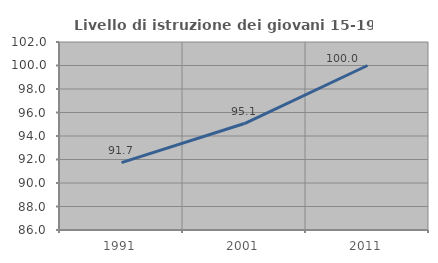
| Category | Livello di istruzione dei giovani 15-19 anni |
|---|---|
| 1991.0 | 91.729 |
| 2001.0 | 95.062 |
| 2011.0 | 100 |